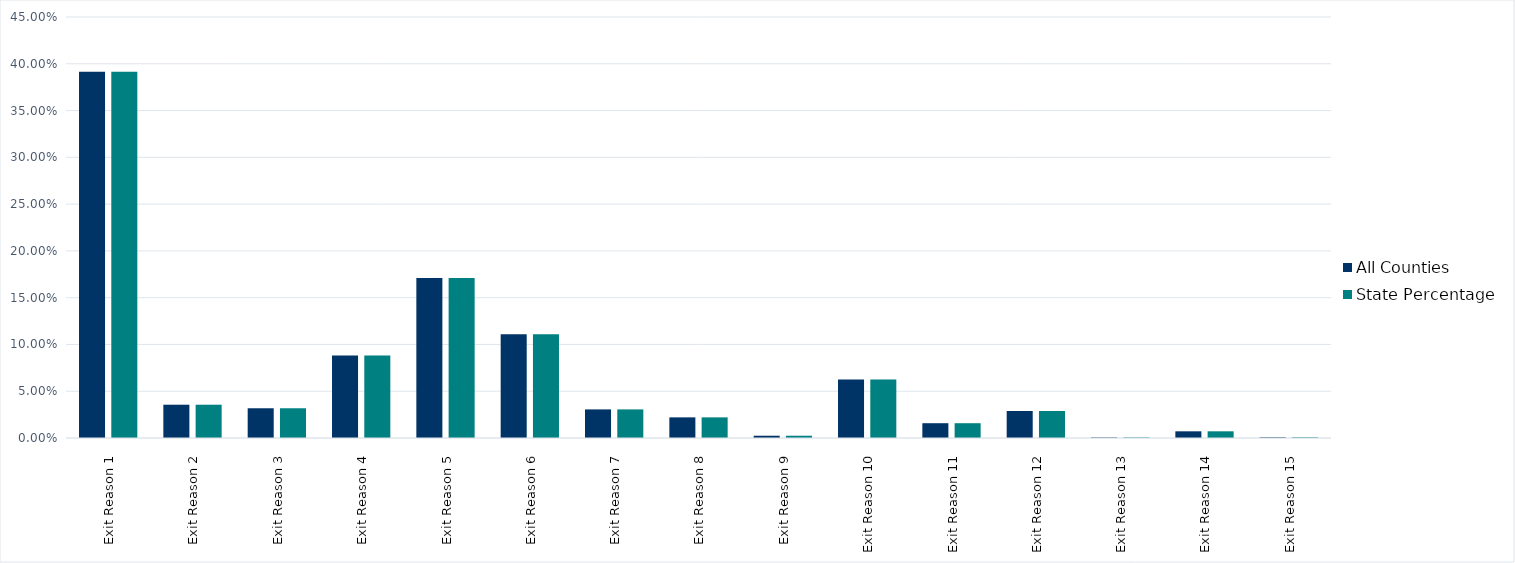
| Category | All Counties | State Percentage |
|---|---|---|
| Exit Reason 1 | 0.392 | 0.392 |
| Exit Reason 2 | 0.036 | 0.036 |
| Exit Reason 3 | 0.032 | 0.032 |
| Exit Reason 4 | 0.088 | 0.088 |
| Exit Reason 5 | 0.171 | 0.171 |
| Exit Reason 6 | 0.111 | 0.111 |
| Exit Reason 7 | 0.031 | 0.031 |
| Exit Reason 8 | 0.022 | 0.022 |
| Exit Reason 9 | 0.002 | 0.002 |
| Exit Reason 10 | 0.062 | 0.062 |
| Exit Reason 11 | 0.016 | 0.016 |
| Exit Reason 12 | 0.029 | 0.029 |
| Exit Reason 13 | 0.001 | 0.001 |
| Exit Reason 14 | 0.007 | 0.007 |
| Exit Reason 15 | 0.001 | 0.001 |